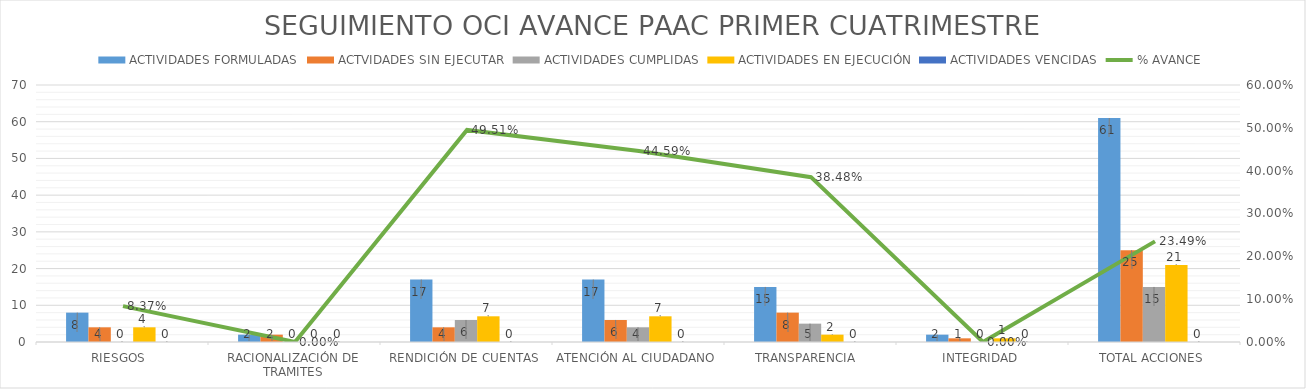
| Category | ACTIVIDADES FORMULADAS | ACTVIDADES SIN EJECUTAR | ACTIVIDADES CUMPLIDAS | ACTIVIDADES EN EJECUCIÓN | ACTIVIDADES VENCIDAS |
|---|---|---|---|---|---|
| RIESGOS  | 8 | 4 | 0 | 4 | 0 |
| RACIONALIZACIÓN DE TRAMITES | 2 | 2 | 0 | 0 | 0 |
| RENDICIÓN DE CUENTAS | 17 | 4 | 6 | 7 | 0 |
| ATENCIÓN AL CIUDADANO | 17 | 6 | 4 | 7 | 0 |
| TRANSPARENCIA  | 15 | 8 | 5 | 2 | 0 |
| INTEGRIDAD | 2 | 1 | 0 | 1 | 0 |
| TOTAL ACCIONES | 61 | 25 | 15 | 21 | 0 |